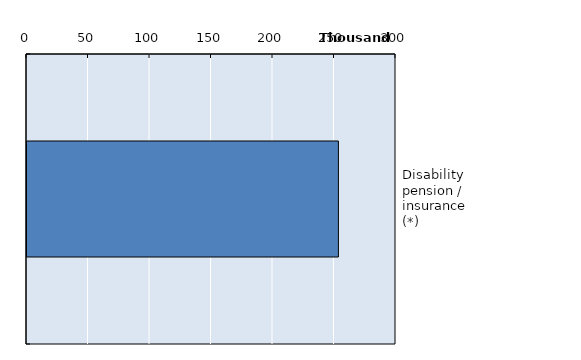
| Category | Series 0 |
|---|---|
| Disability pension / insurance (*) | 253169 |